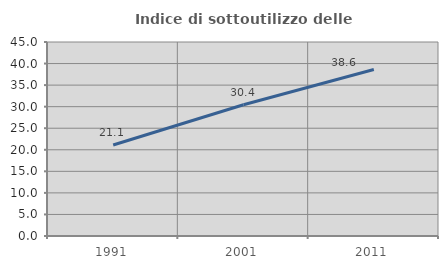
| Category | Indice di sottoutilizzo delle abitazioni  |
|---|---|
| 1991.0 | 21.099 |
| 2001.0 | 30.435 |
| 2011.0 | 38.628 |